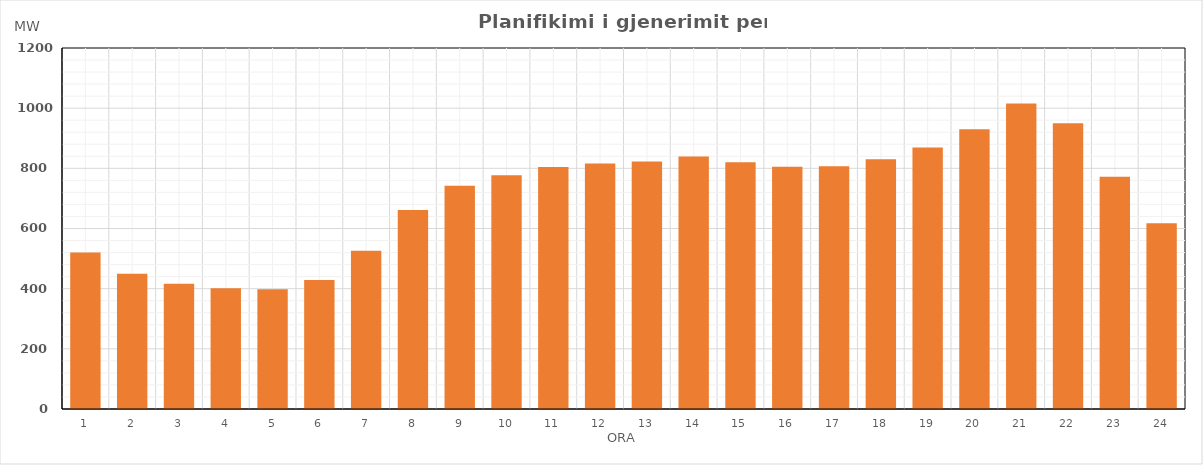
| Category | Max (MW) |
|---|---|
| 0 | 520.09 |
| 1 | 449.72 |
| 2 | 416.08 |
| 3 | 401.28 |
| 4 | 398.29 |
| 5 | 428.55 |
| 6 | 526.43 |
| 7 | 661.29 |
| 8 | 741.99 |
| 9 | 777.07 |
| 10 | 804.16 |
| 11 | 816.46 |
| 12 | 823.05 |
| 13 | 839.45 |
| 14 | 819.85 |
| 15 | 805.5 |
| 16 | 806.67 |
| 17 | 830.11 |
| 18 | 869.19 |
| 19 | 929.82 |
| 20 | 1015.5 |
| 21 | 949.67 |
| 22 | 772.41 |
| 23 | 617.58 |